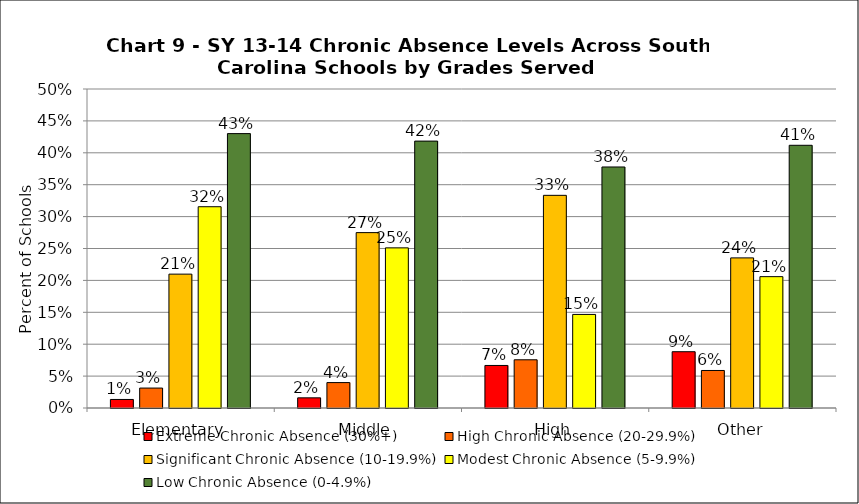
| Category | Extreme Chronic Absence (30%+) | High Chronic Absence (20-29.9%) | Significant Chronic Absence (10-19.9%) | Modest Chronic Absence (5-9.9%) | Low Chronic Absence (0-4.9%) |
|---|---|---|---|---|---|
| 0 | 0.013 | 0.031 | 0.21 | 0.315 | 0.43 |
| 1 | 0.016 | 0.04 | 0.275 | 0.251 | 0.418 |
| 2 | 0.067 | 0.076 | 0.333 | 0.147 | 0.378 |
| 3 | 0.088 | 0.059 | 0.235 | 0.206 | 0.412 |